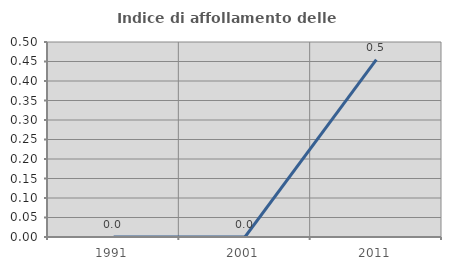
| Category | Indice di affollamento delle abitazioni  |
|---|---|
| 1991.0 | 0 |
| 2001.0 | 0 |
| 2011.0 | 0.455 |